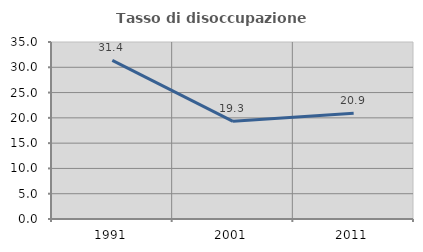
| Category | Tasso di disoccupazione giovanile  |
|---|---|
| 1991.0 | 31.353 |
| 2001.0 | 19.318 |
| 2011.0 | 20.922 |